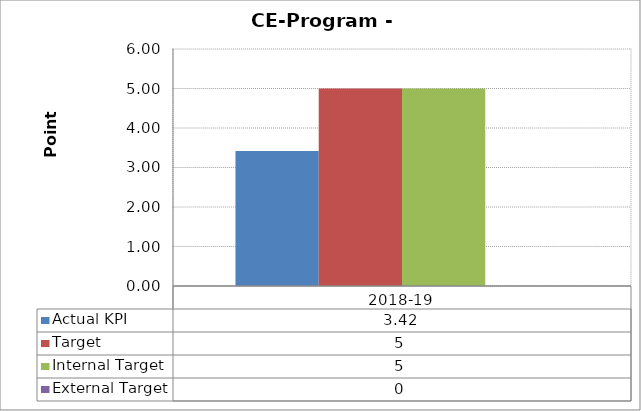
| Category | Actual KPI | Target  | Internal Target | External Target  |
|---|---|---|---|---|
| 2018-19 | 3.419 | 5 | 5 | 0 |